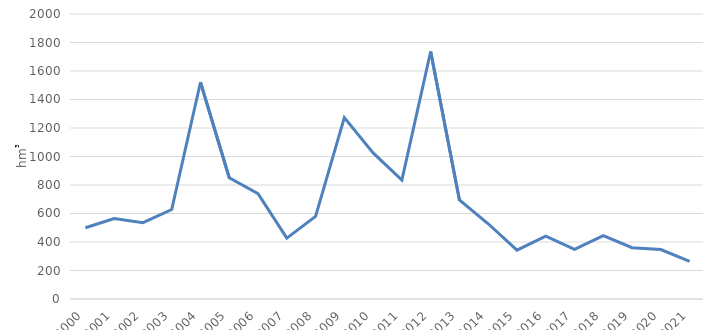
| Category | Вкупно користење на водни ресурси |
|---|---|
| 2000.0 | 500 |
| 2001.0 | 564 |
| 2002.0 | 536 |
| 2003.0 | 628 |
| 2004.0 | 1521 |
| 2005.0 | 851 |
| 2006.0 | 739 |
| 2007.0 | 427 |
| 2008.0 | 580 |
| 2009.0 | 1273 |
| 2010.0 | 1025 |
| 2011.0 | 834 |
| 2012.0 | 1737 |
| 2013.0 | 695 |
| 2014.0 | 528 |
| 2015.0 | 343 |
| 2016.0 | 441 |
| 2017.0 | 348 |
| 2018.0 | 444 |
| 2019.0 | 359.695 |
| 2020.0 | 346.639 |
| 2021.0 | 264 |